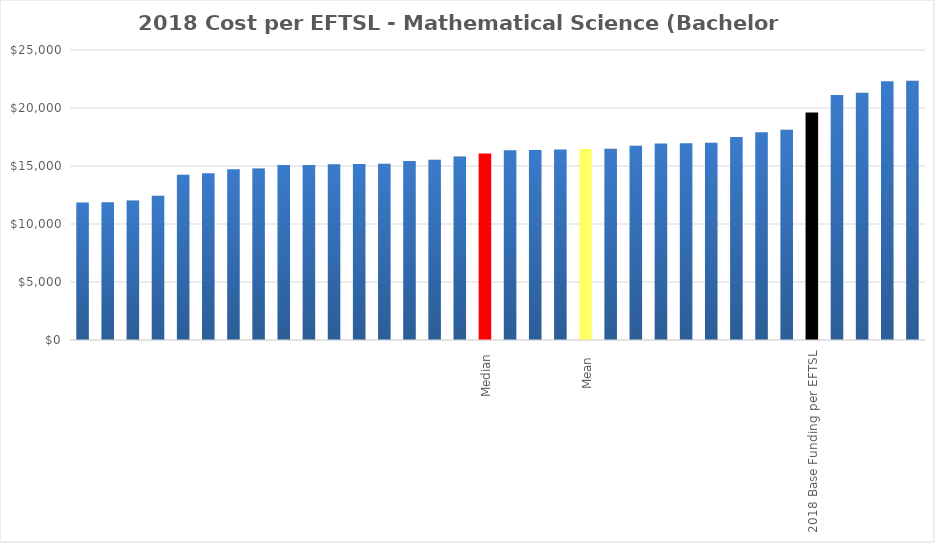
| Category | Series 0 |
|---|---|
|  | 11860.706 |
|  | 11877.075 |
|  | 12018.902 |
|  | 12431.042 |
|  | 14249.243 |
|  | 14385.739 |
|  | 14720.959 |
|  | 14782.003 |
|  | 15090.803 |
|  | 15094.471 |
|  | 15152.449 |
|  | 15181.579 |
|  | 15199.303 |
|  | 15422.114 |
|  | 15536.138 |
|  | 15813.638 |
| Median | 16087.94 |
|  | 16362.246 |
|  | 16389.76 |
|  | 16430.55 |
| Mean  | 16464.28 |
|  | 16484.986 |
|  | 16745.372 |
|  | 16943.796 |
|  | 16953.531 |
|  | 17011.02 |
|  | 17507.587 |
|  | 17903.428 |
|  | 18134.775 |
| 2018 Base Funding per EFTSL | 19617 |